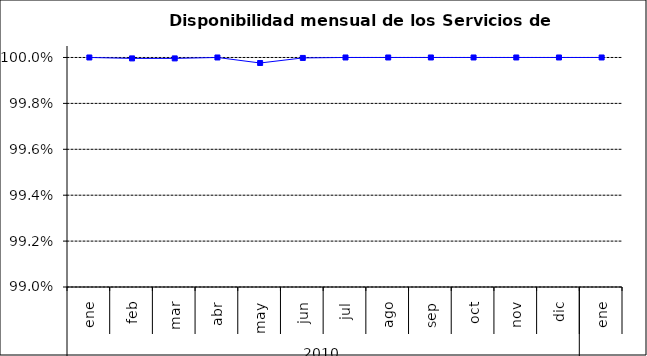
| Category | SCL * |
|---|---|
| 0 | 1 |
| 1 | 1 |
| 2 | 1 |
| 3 | 1 |
| 4 | 1 |
| 5 | 1 |
| 6 | 1 |
| 7 | 1 |
| 8 | 1 |
| 9 | 1 |
| 10 | 1 |
| 11 | 1 |
| 12 | 1 |